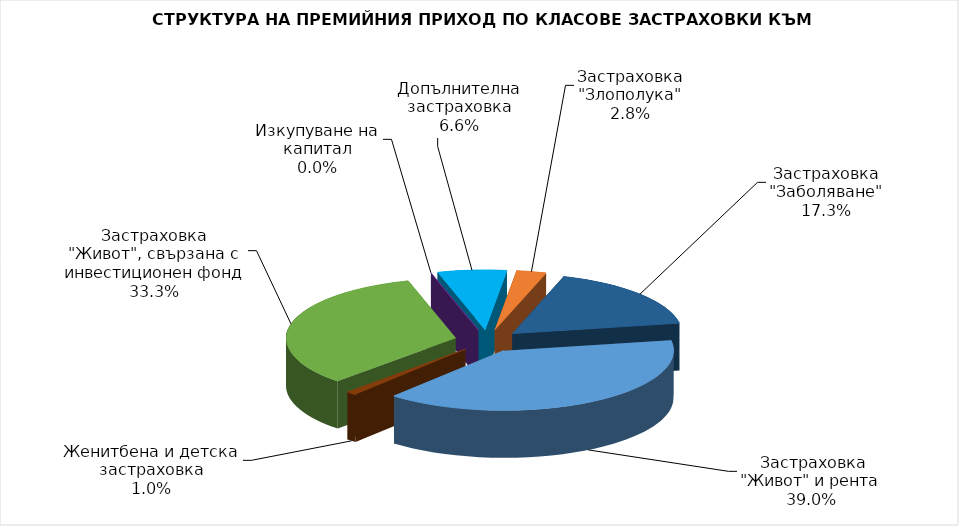
| Category |  Застраховка "Живот" и рента |
|---|---|
|  Застраховка "Живот" и рента | 172643699.685 |
| Женитбена и детска застраховка | 4459206.005 |
| Застраховка "Живот", свързана с инвестиционен фонд | 147242016.33 |
| Изкупуване на капитал | 0 |
| Допълнителна застраховка | 29078887.881 |
| Застраховка "Злополука" | 12580585.93 |
| Застраховка "Заболяване" | 76673807.05 |